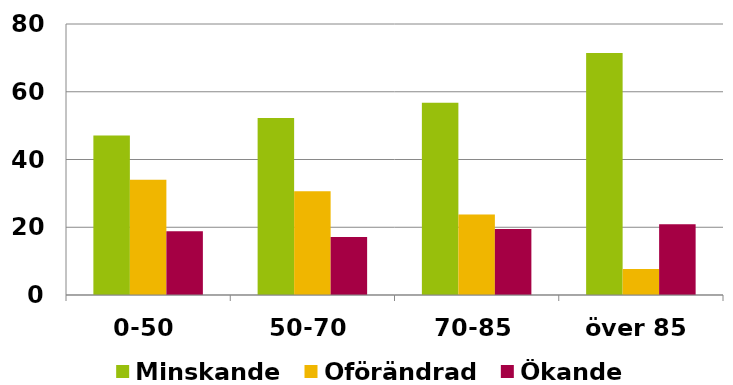
| Category | Minskande | Oförändrad | Ökande |
|---|---|---|---|
| 0-50 | 47.111 | 34.038 | 18.851 |
| 50-70 | 52.249 | 30.601 | 17.15 |
| 70-85 | 56.775 | 23.728 | 19.498 |
| över 85 | 71.429 | 7.66 | 20.911 |